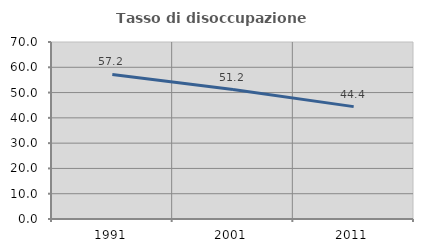
| Category | Tasso di disoccupazione giovanile  |
|---|---|
| 1991.0 | 57.163 |
| 2001.0 | 51.175 |
| 2011.0 | 44.444 |